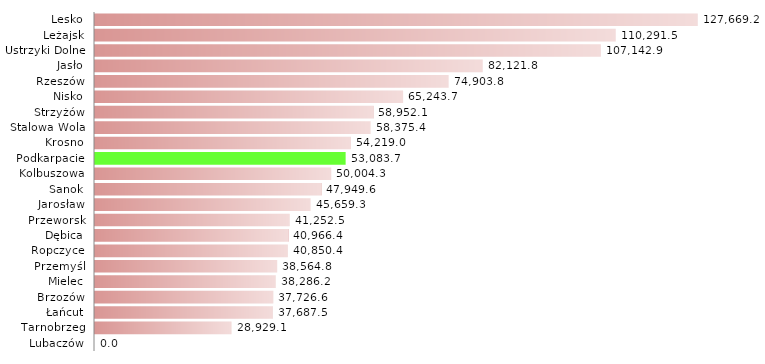
| Category | Refundacja kosztów wyposażenia i doposażenia stanowiska pracy |
|---|---|
| Lubaczów | 0 |
| Tarnobrzeg | 28929.118 |
| Łańcut | 37687.5 |
| Brzozów | 37726.62 |
| Mielec | 38286.187 |
| Przemyśl | 38564.82 |
| Ropczyce | 40850.424 |
| Dębica | 40966.443 |
| Przeworsk | 41252.48 |
| Jarosław | 45659.341 |
| Sanok | 47949.562 |
| Kolbuszowa | 50004.322 |
| Podkarpacie | 53083.715 |
| Krosno | 54219.033 |
| Stalowa Wola | 58375.379 |
| Strzyżów | 58952.052 |
| Nisko | 65243.697 |
| Rzeszów | 74903.813 |
| Jasło | 82121.771 |
| Ustrzyki Dolne | 107142.857 |
| Leżajsk | 110291.496 |
| Lesko | 127669.182 |